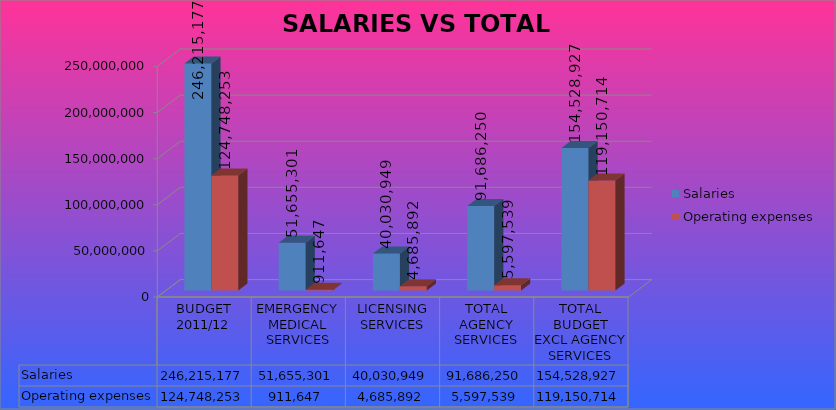
| Category | Salaries | Operating expenses |
|---|---|---|
| BUDGET 2011/12 | 246215177 | 124748253 |
| EMERGENCY MEDICAL SERVICES | 51655301 | 911647 |
| LICENSING SERVICES | 40030949 | 4685892 |
| TOTAL AGENCY SERVICES | 91686250 | 5597539 |
| TOTAL BUDGET EXCL AGENCY SERVICES | 154528927 | 119150714 |